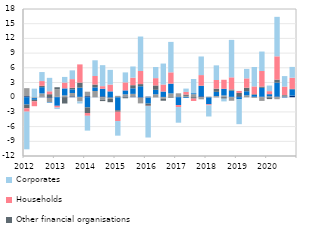
| Category | Non-profit and other organisations | Local authorities  | Currency in circulation | Other financial organisations | Households | Corporates |
|---|---|---|---|---|---|---|
| 2012 | 0.202 | 1.641 | -1.502 | -0.756 | -0.691 | -7.686 |
| II | 0.002 | -0.188 | -0.341 | -0.312 | -0.998 | 1.747 |
| III | 0.11 | 0.664 | 1.273 | 0.274 | 0.972 | 1.84 |
| IV | -0.138 | -0.873 | -0.098 | 0.61 | 0.594 | 2.749 |
| 2013 | 0.079 | 1.527 | -1.754 | 0.426 | -0.373 | -0.296 |
| II | 0.059 | 0.305 | 1.437 | -1.286 | 1.19 | 1.148 |
| III | 0.165 | 0.682 | 0.754 | 0.325 | 1.76 | 1.79 |
| IV | 0.076 | -0.87 | 1.873 | 1.027 | 3.718 | -0.415 |
| 2014 | 0.199 | 0.924 | -2.085 | -1.142 | -0.569 | -3.023 |
| II | 0.035 | 1.231 | 0.74 | 0.578 | 1.742 | 3.202 |
| III | 0.178 | -0.545 | 1.556 | -0.251 | 0.516 | 4.284 |
| IV | -0.104 | -0.237 | 1.19 | -0.68 | 1.391 | 3 |
| 2015 | -0.031 | 0.277 | -2.623 | -0.313 | -1.902 | -2.981 |
| II | 0.129 | 0.455 | 0.809 | -0.218 | 1.631 | 2.039 |
| III | 0.145 | 0.535 | 1.129 | 0.641 | 1.533 | 2.287 |
| IV | -0.109 | -1.155 | 2.237 | 0.437 | 2.676 | 7.032 |
| 2016 | 0.104 | -0.104 | -1.193 | -0.452 | -0.054 | -6.424 |
| II | -0.033 | 0.597 | 0.912 | 0.894 | 1.489 | 2.276 |
| III | 0.058 | -0.277 | 1.097 | -0.443 | 1.429 | 4.281 |
| IV | -0.001 | 0.781 | 1.984 | -0.118 | 2.31 | 6.213 |
| 2017 | 0.133 | 0.64 | -1.599 | 0.025 | -0.411 | -3.193 |
| II | 0.059 | 0.207 | -0.138 | 0.273 | 0.541 | 0.678 |
| III | 0.02 | 0.6 | 0.199 | -0.281 | -0.487 | 2.895 |
| IV | 0.183 | -0.435 | 2.116 | 0.066 | 2.148 | 3.798 |
| 2018 | -0.069 | 0.088 | -1.382 | 0.022 | -0.202 | -2.284 |
| II | 0.083 | 0.156 | 0.854 | 0.654 | 1.762 | 2.986 |
| III | 0.089 | 0.272 | 1.347 | -0.301 | 1.848 | -0.557 |
| IV | 0.082 | -0.727 | 1.258 | 0.234 | 2.481 | 7.641 |
| 2019 | 0.187 | 0.021 | -0.439 | 0.661 | 0.411 | -5.065 |
| II | -0.015 | 0.395 | 0.82 | 0.717 | 1.911 | 1.934 |
| III | 0.109 | -0.155 | 0.363 | 0.139 | 1.592 | 3.965 |
| IV | 0.106 | -0.756 | 1.801 | 0.269 | 3.171 | 3.974 |
| 2020 | -0.044 | 0.196 | 0.422 | -0.345 | 0.62 | 1.138 |
| II | 0.14 | -0.412 | 2.831 | 0.621 | 4.751 | 8.057 |
| III | 0.136 | 0.188 | -0.059 | 0.127 | 1.713 | 2.143 |
| IV | 0.323 | 0.01 | 1.277 | 0.077 | 2.288 | 2.209 |